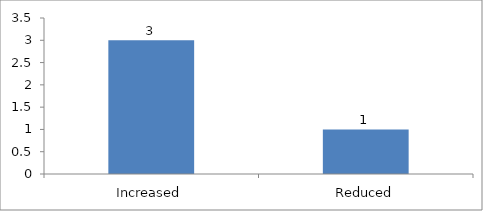
| Category | If no, should it be reduced or increased |
|---|---|
| Increased | 3 |
| Reduced | 1 |